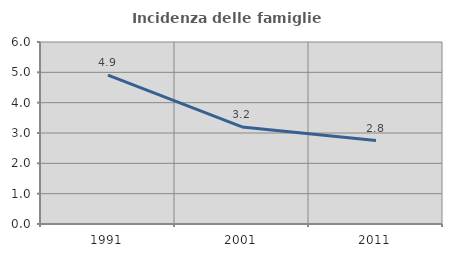
| Category | Incidenza delle famiglie numerose |
|---|---|
| 1991.0 | 4.905 |
| 2001.0 | 3.2 |
| 2011.0 | 2.751 |